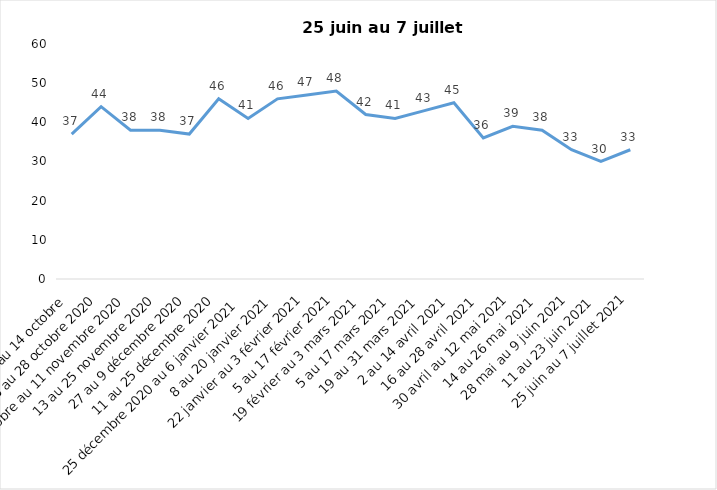
| Category | Toujours aux trois mesures |
|---|---|
| 2 au 14 octobre  | 37 |
| 16 au 28 octobre 2020 | 44 |
| 30 octobre au 11 novembre 2020 | 38 |
| 13 au 25 novembre 2020 | 38 |
| 27 au 9 décembre 2020 | 37 |
| 11 au 25 décembre 2020 | 46 |
| 25 décembre 2020 au 6 janvier 2021 | 41 |
| 8 au 20 janvier 2021 | 46 |
| 22 janvier au 3 février 2021 | 47 |
| 5 au 17 février 2021 | 48 |
| 19 février au 3 mars 2021 | 42 |
| 5 au 17 mars 2021 | 41 |
| 19 au 31 mars 2021 | 43 |
| 2 au 14 avril 2021 | 45 |
| 16 au 28 avril 2021 | 36 |
| 30 avril au 12 mai 2021 | 39 |
| 14 au 26 mai 2021 | 38 |
| 28 mai au 9 juin 2021 | 33 |
| 11 au 23 juin 2021 | 30 |
| 25 juin au 7 juillet 2021 | 33 |